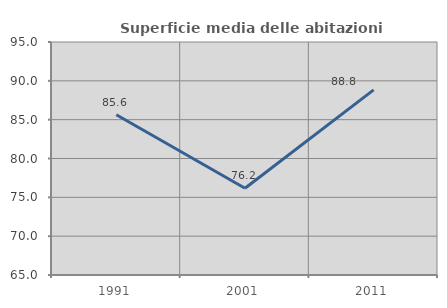
| Category | Superficie media delle abitazioni occupate |
|---|---|
| 1991.0 | 85.632 |
| 2001.0 | 76.161 |
| 2011.0 | 88.841 |